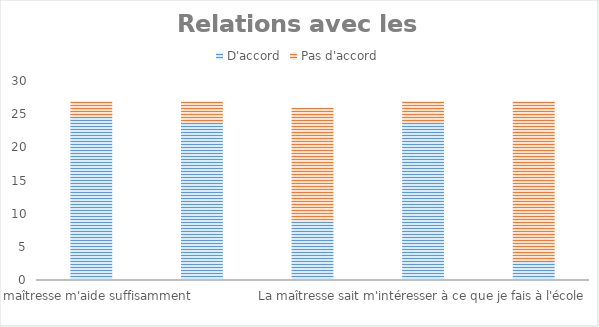
| Category | D'accord | Pas d'accord |
|---|---|---|
| La maîtresse m'aide suffisamment | 25 | 2 |
| La maîtresse me félicite | 24 | 3 |
| J'aimerais que la maîtresse m'explique plus les choses difficiles | 9 | 17 |
| La maîtresse sait m'intéresser à ce que je fais à l'école | 24 | 3 |
| La maîtresse a du mal à faire respecter les règles de la classe | 3 | 24 |